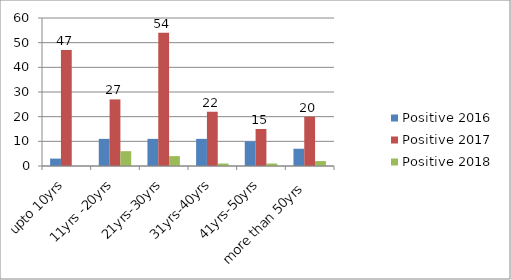
| Category | Positive 2016 | Positive 2017 | Positive 2018 |
|---|---|---|---|
| upto 10yrs | 3 | 47 | 0 |
| 11yrs -20yrs | 11 | 27 | 6 |
| 21yrs-30yrs | 11 | 54 | 4 |
| 31yrs-40yrs | 11 | 22 | 1 |
| 41yrs-50yrs | 10 | 15 | 1 |
| more than 50yrs | 7 | 20 | 2 |